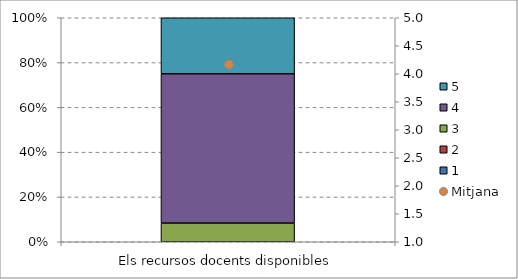
| Category | 1 | 2 | 3 | 4 | 5 |
|---|---|---|---|---|---|
| Els recursos docents disponibles | 0 | 0 | 0.083 | 0.667 | 0.25 |